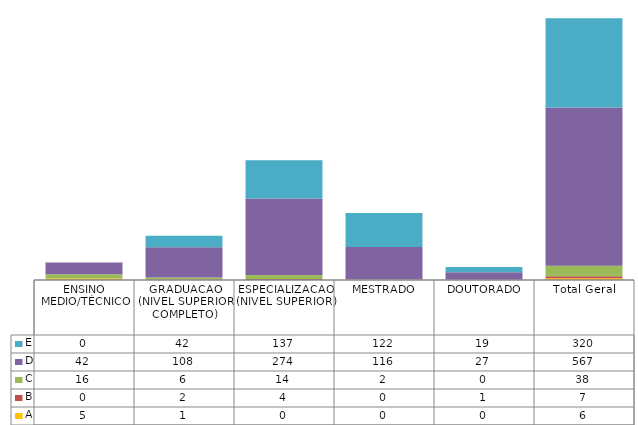
| Category | A | B | C | D | E |
|---|---|---|---|---|---|
| ENSINO MEDIO/TÉCNICO | 5 | 0 | 16 | 42 | 0 |
| GRADUACAO (NIVEL SUPERIOR COMPLETO) | 1 | 2 | 6 | 108 | 42 |
| ESPECIALIZACAO (NIVEL SUPERIOR) | 0 | 4 | 14 | 274 | 137 |
| MESTRADO | 0 | 0 | 2 | 116 | 122 |
| DOUTORADO | 0 | 1 | 0 | 27 | 19 |
| Total Geral | 6 | 7 | 38 | 567 | 320 |